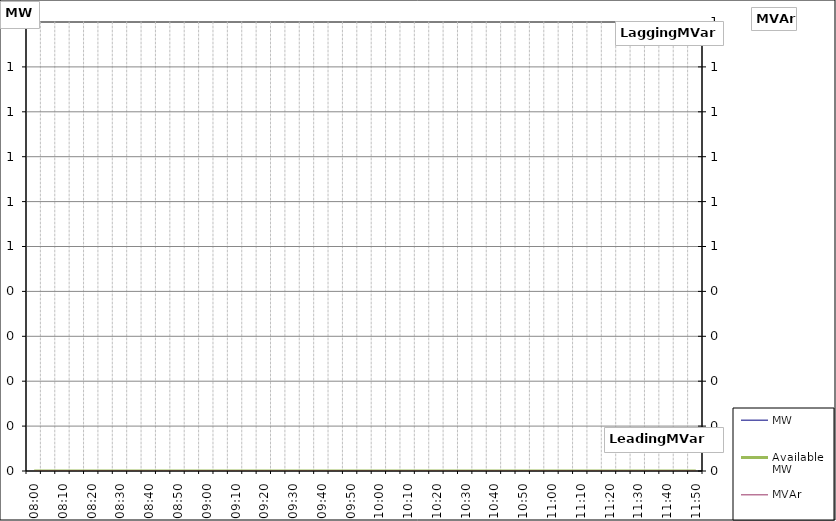
| Category | MW | Available MW |
|---|---|---|
| 0.3333333333333333 | 0 | 0 |
| 0.3368055555555556 | 0 | 0 |
| 0.340277777777778 | 0 | 0 |
| 0.34375 | 0 | 0 |
| 0.347222222222222 | 0 | 0 |
| 0.350694444444444 | 0 | 0 |
| 0.354166666666667 | 0 | 0 |
| 0.357638888888889 | 0 | 0 |
| 0.361111111111111 | 0 | 0 |
| 0.364583333333334 | 0 | 0 |
| 0.368055555555556 | 0 | 0 |
| 0.371527777777778 | 0 | 0 |
| 0.375 | 0 | 0 |
| 0.378472222222223 | 0 | 0 |
| 0.381944444444445 | 0 | 0 |
| 0.385416666666667 | 0 | 0 |
| 0.38888888888889 | 0 | 0 |
| 0.392361111111112 | 0 | 0 |
| 0.395833333333334 | 0 | 0 |
| 0.399305555555556 | 0 | 0 |
| 0.402777777777779 | 0 | 0 |
| 0.406250000000001 | 0 | 0 |
| 0.409722222222223 | 0 | 0 |
| 0.413194444444445 | 0 | 0 |
| 0.416666666666668 | 0 | 0 |
| 0.42013888888889 | 0 | 0 |
| 0.423611111111112 | 0 | 0 |
| 0.427083333333334 | 0 | 0 |
| 0.430555555555557 | 0 | 0 |
| 0.434027777777779 | 0 | 0 |
| 0.437500000000001 | 0 | 0 |
| 0.440972222222223 | 0 | 0 |
| 0.444444444444445 | 0 | 0 |
| 0.447916666666668 | 0 | 0 |
| 0.45138888888889 | 0 | 0 |
| 0.454861111111112 | 0 | 0 |
| 0.458333333333335 | 0 | 0 |
| 0.461805555555557 | 0 | 0 |
| 0.465277777777779 | 0 | 0 |
| 0.468750000000001 | 0 | 0 |
| 0.472222222222224 | 0 | 0 |
| 0.475694444444446 | 0 | 0 |
| 0.479166666666668 | 0 | 0 |
| 0.48263888888889 | 0 | 0 |
| 0.486111111111113 | 0 | 0 |
| 0.489583333333335 | 0 | 0 |
| 0.493055555555557 | 0 | 0 |